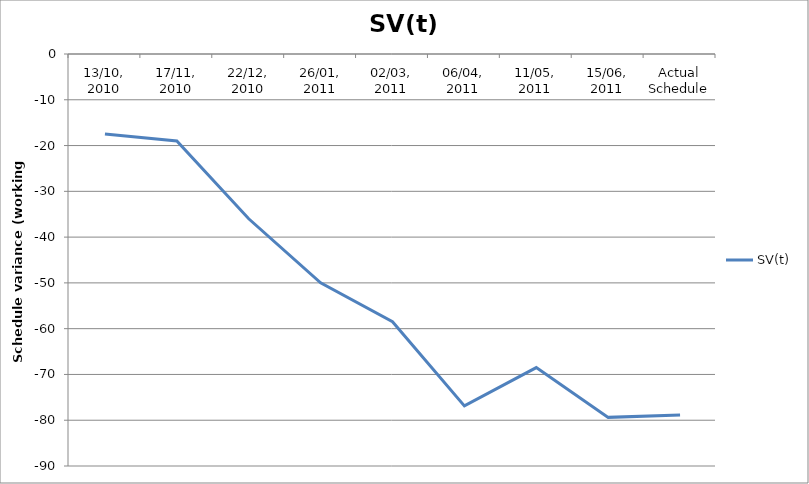
| Category | SV(t) |
|---|---|
| 13/10, 2010 | -17.5 |
| 17/11, 2010 | -19 |
| 22/12, 2010 | -36 |
| 26/01, 2011 | -50 |
| 02/03, 2011 | -58.5 |
| 06/04, 2011 | -76.875 |
| 11/05, 2011 | -68.5 |
| 15/06, 2011 | -79.375 |
| Actual Schedule | -78.875 |